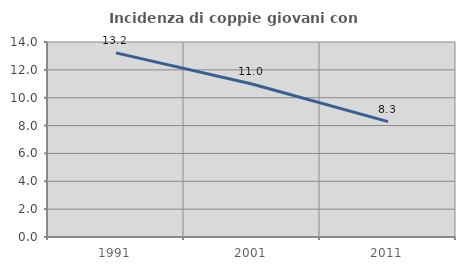
| Category | Incidenza di coppie giovani con figli |
|---|---|
| 1991.0 | 13.218 |
| 2001.0 | 10.983 |
| 2011.0 | 8.284 |